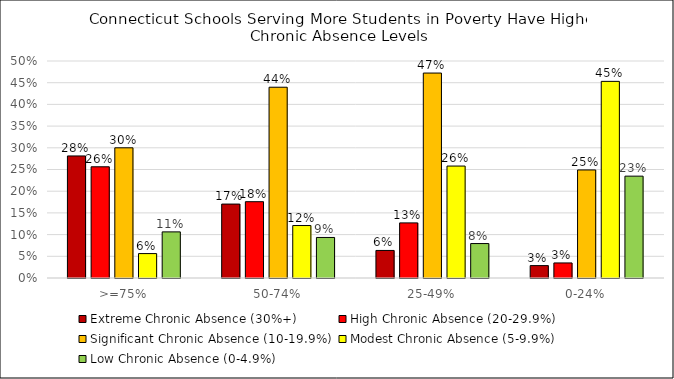
| Category | Extreme Chronic Absence (30%+) | High Chronic Absence (20-29.9%) | Significant Chronic Absence (10-19.9%) | Modest Chronic Absence (5-9.9%) | Low Chronic Absence (0-4.9%) |
|---|---|---|---|---|---|
| >=75% | 0.281 | 0.256 | 0.3 | 0.056 | 0.106 |
| 50-74% | 0.17 | 0.176 | 0.44 | 0.121 | 0.093 |
| 25-49% | 0.063 | 0.127 | 0.472 | 0.258 | 0.079 |
| 0-24% | 0.029 | 0.035 | 0.249 | 0.453 | 0.235 |